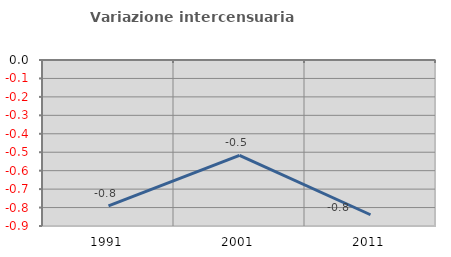
| Category | Variazione intercensuaria annua |
|---|---|
| 1991.0 | -0.791 |
| 2001.0 | -0.517 |
| 2011.0 | -0.839 |